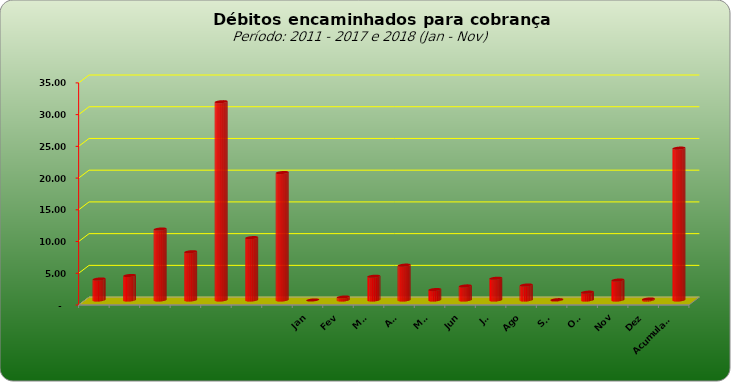
| Category |  3.309.443,02  |
|---|---|
|  | 3309443.02 |
|  | 3859728.44 |
|  | 11181928.25 |
|  | 7600526.01 |
|  | 31248623.5 |
|  | 9830198.34 |
|  | 20083556.95 |
| Jan | 0 |
| Fev | 468831.1 |
| Mar | 3741527.45 |
| Abr | 5493663.59 |
| Mai | 1643658.45 |
| Jun | 2215524.43 |
| Jul | 3425456.07 |
| Ago | 2362409.7 |
| Set | 48910.4 |
| Out | 1233325.4 |
| Nov | 3144659.97 |
| Dez | 153767.52 |
| Acumulado | 23931734.08 |